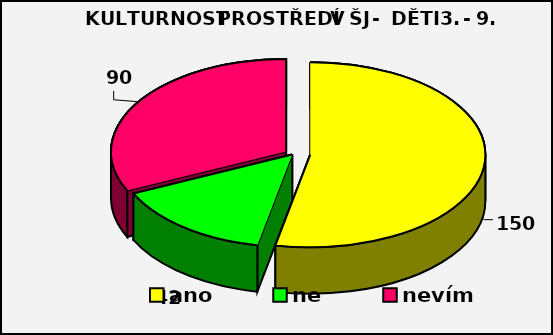
| Category | Series 0 |
|---|---|
| ano | 150 |
| ne | 42 |
| nevím  | 90 |